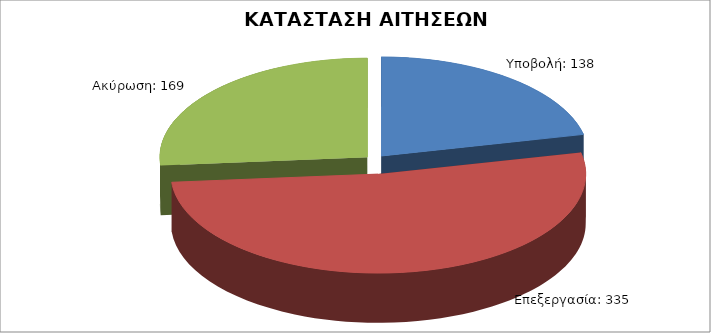
| Category | Series 0 |
|---|---|
| Υποβολή: | 138 |
| Επεξεργασία: | 335 |
| Ακύρωση: | 169 |